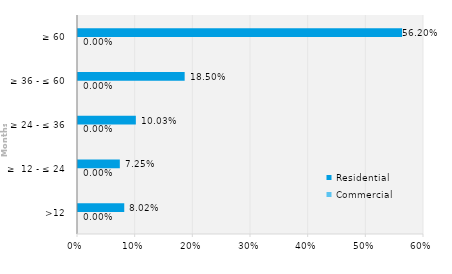
| Category | Commercial | Residential |
|---|---|---|
| >12 | 0 | 0.08 |
| ≥  12 - ≤ 24 | 0 | 0.073 |
| ≥ 24 - ≤ 36 | 0 | 0.1 |
| ≥ 36 - ≤ 60 | 0 | 0.185 |
| ≥ 60 | 0 | 0.562 |